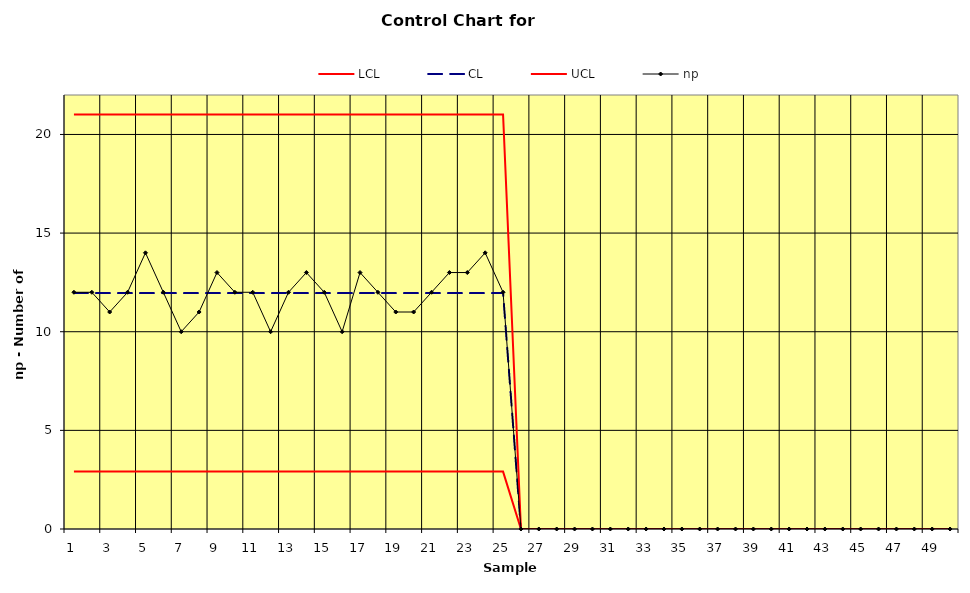
| Category | LCL | CL | UCL | np |
|---|---|---|---|---|
| 1.0 | 2.911 | 11.96 | 21.009 | 12 |
| 2.0 | 2.911 | 11.96 | 21.009 | 12 |
| 3.0 | 2.911 | 11.96 | 21.009 | 11 |
| 4.0 | 2.911 | 11.96 | 21.009 | 12 |
| 5.0 | 2.911 | 11.96 | 21.009 | 14 |
| 6.0 | 2.911 | 11.96 | 21.009 | 12 |
| 7.0 | 2.911 | 11.96 | 21.009 | 10 |
| 8.0 | 2.911 | 11.96 | 21.009 | 11 |
| 9.0 | 2.911 | 11.96 | 21.009 | 13 |
| 10.0 | 2.911 | 11.96 | 21.009 | 12 |
| 11.0 | 2.911 | 11.96 | 21.009 | 12 |
| 12.0 | 2.911 | 11.96 | 21.009 | 10 |
| 13.0 | 2.911 | 11.96 | 21.009 | 12 |
| 14.0 | 2.911 | 11.96 | 21.009 | 13 |
| 15.0 | 2.911 | 11.96 | 21.009 | 12 |
| 16.0 | 2.911 | 11.96 | 21.009 | 10 |
| 17.0 | 2.911 | 11.96 | 21.009 | 13 |
| 18.0 | 2.911 | 11.96 | 21.009 | 12 |
| 19.0 | 2.911 | 11.96 | 21.009 | 11 |
| 20.0 | 2.911 | 11.96 | 21.009 | 11 |
| 21.0 | 2.911 | 11.96 | 21.009 | 12 |
| 22.0 | 2.911 | 11.96 | 21.009 | 13 |
| 23.0 | 2.911 | 11.96 | 21.009 | 13 |
| 24.0 | 2.911 | 11.96 | 21.009 | 14 |
| 25.0 | 2.911 | 11.96 | 21.009 | 12 |
| 26.0 | 0 | 0 | 0 | 0 |
| 27.0 | 0 | 0 | 0 | 0 |
| 28.0 | 0 | 0 | 0 | 0 |
| 29.0 | 0 | 0 | 0 | 0 |
| 30.0 | 0 | 0 | 0 | 0 |
| 31.0 | 0 | 0 | 0 | 0 |
| 32.0 | 0 | 0 | 0 | 0 |
| 33.0 | 0 | 0 | 0 | 0 |
| 34.0 | 0 | 0 | 0 | 0 |
| 35.0 | 0 | 0 | 0 | 0 |
| 36.0 | 0 | 0 | 0 | 0 |
| 37.0 | 0 | 0 | 0 | 0 |
| 38.0 | 0 | 0 | 0 | 0 |
| 39.0 | 0 | 0 | 0 | 0 |
| 40.0 | 0 | 0 | 0 | 0 |
| 41.0 | 0 | 0 | 0 | 0 |
| 42.0 | 0 | 0 | 0 | 0 |
| 43.0 | 0 | 0 | 0 | 0 |
| 44.0 | 0 | 0 | 0 | 0 |
| 45.0 | 0 | 0 | 0 | 0 |
| 46.0 | 0 | 0 | 0 | 0 |
| 47.0 | 0 | 0 | 0 | 0 |
| 48.0 | 0 | 0 | 0 | 0 |
| 49.0 | 0 | 0 | 0 | 0 |
| 50.0 | 0 | 0 | 0 | 0 |